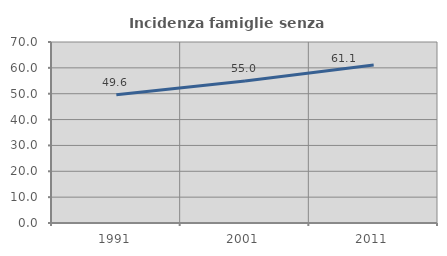
| Category | Incidenza famiglie senza nuclei |
|---|---|
| 1991.0 | 49.627 |
| 2001.0 | 54.955 |
| 2011.0 | 61.062 |